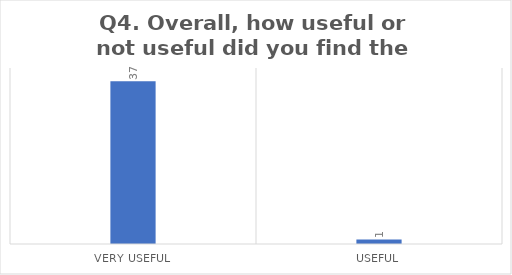
| Category | Q4. Overall, how useful or not useful did you find the training? |
|---|---|
| Very useful | 37 |
| Useful | 1 |